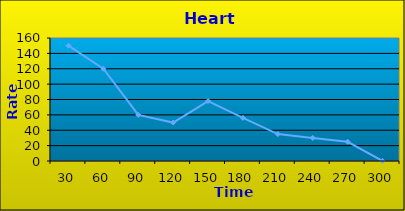
| Category | Series 0 |
|---|---|
| 30.0 | 150 |
| 60.0 | 120 |
| 90.0 | 60 |
| 120.0 | 50 |
| 150.0 | 78 |
| 180.0 | 56 |
| 210.0 | 35 |
| 240.0 | 30 |
| 270.0 | 25 |
| 300.0 | 0 |